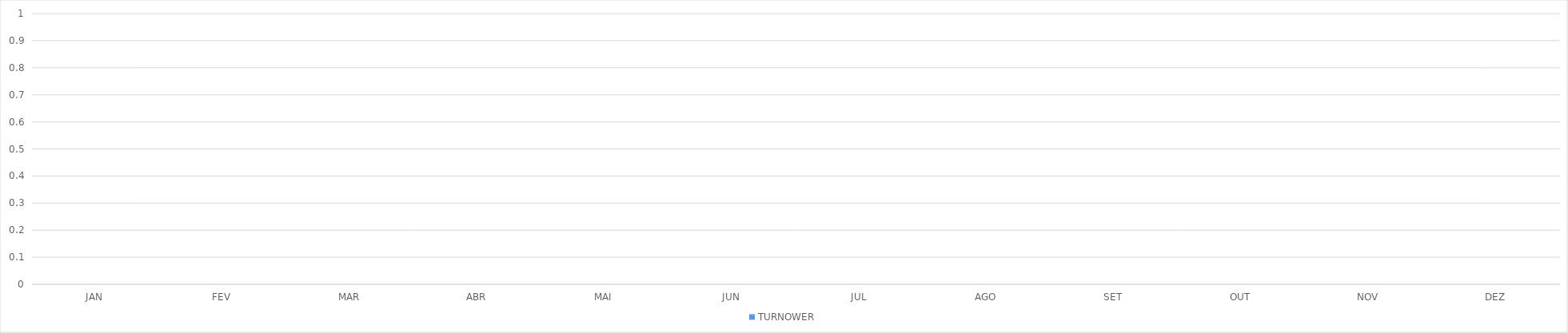
| Category | TURNOWER |
|---|---|
| JAN | 0 |
| FEV | 0 |
| MAR | 0 |
| ABR | 0 |
| MAI | 0 |
| JUN | 0 |
| JUL | 0 |
| AGO | 0 |
| SET | 0 |
| OUT | 0 |
| NOV | 0 |
| DEZ | 0 |